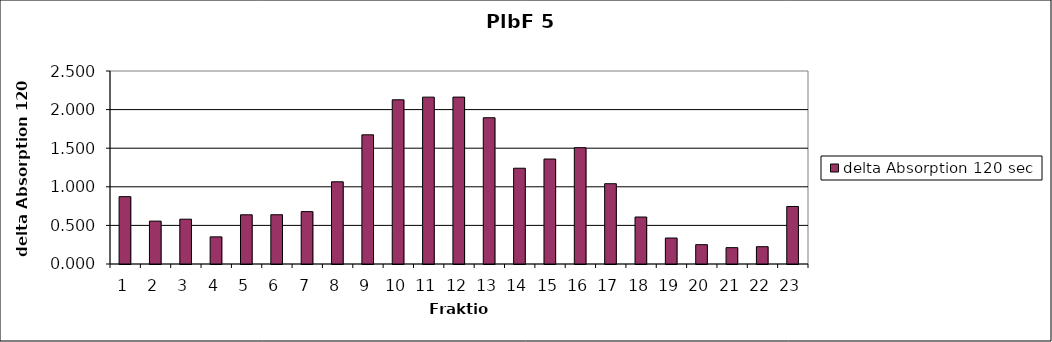
| Category | delta Absorption 120 sec |
|---|---|
| 0 | 0.872 |
| 1 | 0.556 |
| 2 | 0.58 |
| 3 | 0.352 |
| 4 | 0.638 |
| 5 | 0.638 |
| 6 | 0.678 |
| 7 | 1.065 |
| 8 | 1.673 |
| 9 | 2.127 |
| 10 | 2.162 |
| 11 | 2.162 |
| 12 | 1.895 |
| 13 | 1.241 |
| 14 | 1.36 |
| 15 | 1.507 |
| 16 | 1.04 |
| 17 | 0.608 |
| 18 | 0.336 |
| 19 | 0.25 |
| 20 | 0.212 |
| 21 | 0.224 |
| 22 | 0.745 |